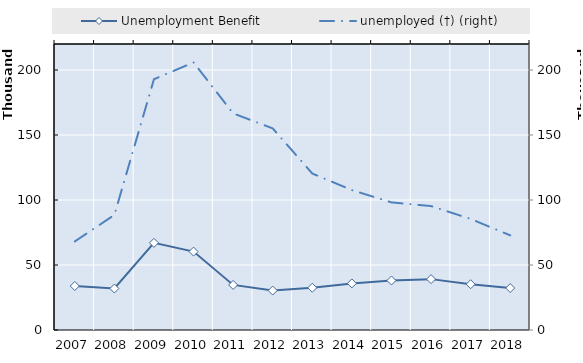
| Category | Series 4 | Series 5 | Series 6 | Series 7 | Series 8 | Series 9 | Series 10 | Series 11 | Series 12 | Series 13 | Series 14 | Series 15 | Series 16 | Series 17 | Series 18 | Series 19 | Unemployment Benefit |
|---|---|---|---|---|---|---|---|---|---|---|---|---|---|---|---|---|---|
| 2007.0 |  |  |  |  |  |  |  |  |  |  |  |  |  |  |  |  | 33854.167 |
| 2008.0 |  |  |  |  |  |  |  |  |  |  |  |  |  |  |  |  | 31904.5 |
| 2009.0 |  |  |  |  |  |  |  |  |  |  |  |  |  |  |  |  | 67031 |
| 2010.0 |  |  |  |  |  |  |  |  |  |  |  |  |  |  |  |  | 60316 |
| 2011.0 |  |  |  |  |  |  |  |  |  |  |  |  |  |  |  |  | 34686 |
| 2012.0 |  |  |  |  |  |  |  |  |  |  |  |  |  |  |  |  | 30353 |
| 2013.0 |  |  |  |  |  |  |  |  |  |  |  |  |  |  |  |  | 32498 |
| 2014.0 |  |  |  |  |  |  |  |  |  |  |  |  |  |  |  |  | 35849 |
| 2015.0 |  |  |  |  |  |  |  |  |  |  |  |  |  |  |  |  | 38070 |
| 2016.0 |  |  |  |  |  |  |  |  |  |  |  |  |  |  |  |  | 39130 |
| 2017.0 |  |  |  |  |  |  |  |  |  |  |  |  |  |  |  |  | 35205 |
| 2018.0 |  |  |  |  |  |  |  |  |  |  |  |  |  |  |  |  | 32283 |